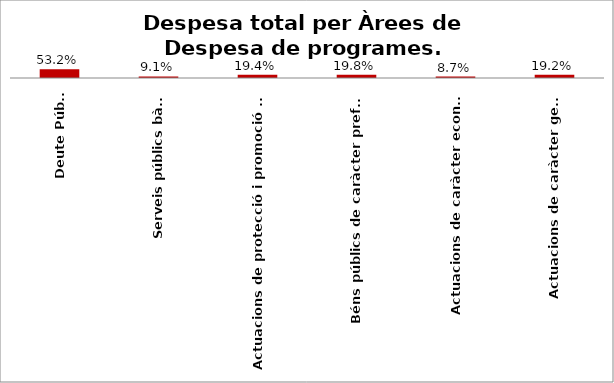
| Category | Series 0 |
|---|---|
| Deute Públic | 0.532 |
| Serveis públics bàsics | 0.091 |
| Actuacions de protecció i promoció social | 0.194 |
| Béns públics de caràcter preferent | 0.198 |
| Actuacions de caràcter econòmic | 0.087 |
| Actuacions de caràcter general | 0.192 |